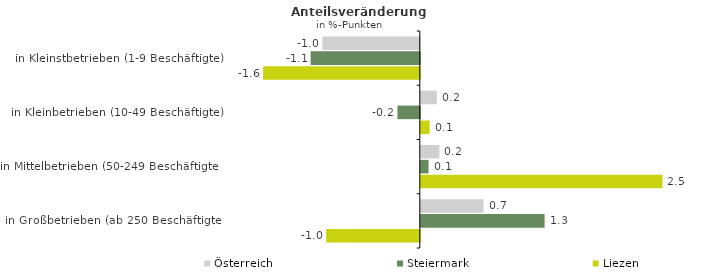
| Category | Österreich | Steiermark | Liezen |
|---|---|---|---|
| in Kleinstbetrieben (1-9 Beschäftigte) | -1.011 | -1.133 | -1.626 |
| in Kleinbetrieben (10-49 Beschäftigte) | 0.167 | -0.232 | 0.091 |
| in Mittelbetrieben (50-249 Beschäftigte) | 0.193 | 0.081 | 2.507 |
| in Großbetrieben (ab 250 Beschäftigte) | 0.651 | 1.284 | -0.972 |